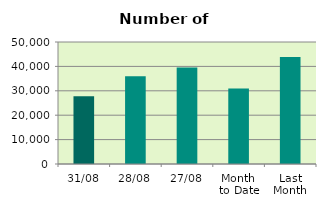
| Category | Series 0 |
|---|---|
| 31/08 | 27806 |
| 28/08 | 35972 |
| 27/08 | 39574 |
| Month 
to Date | 30949.143 |
| Last
Month | 43867.217 |